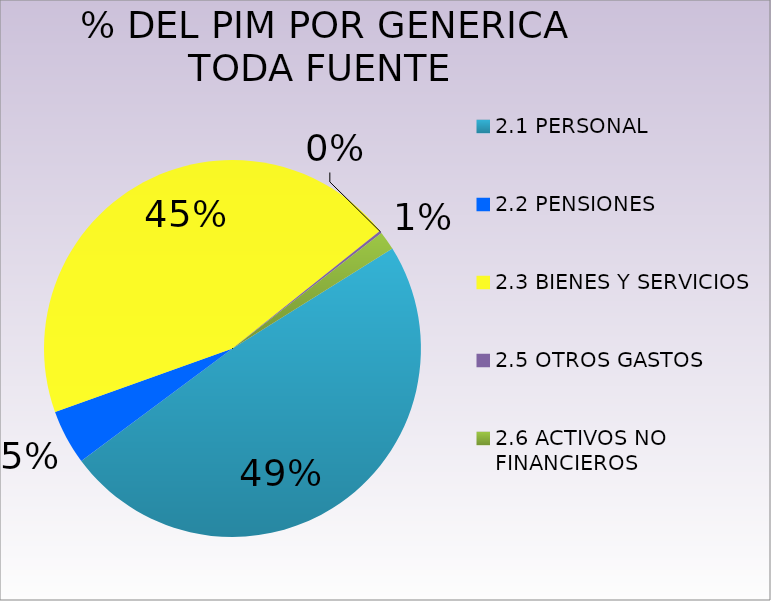
| Category | Series 0 |
|---|---|
| 2.1 PERSONAL | 24399682 |
| 2.2 PENSIONES | 2356422 |
| 2.3 BIENES Y SERVICIOS | 22416745 |
| 2.5 OTROS GASTOS  | 113222 |
| 2.6 ACTIVOS NO FINANCIEROS  | 805452 |